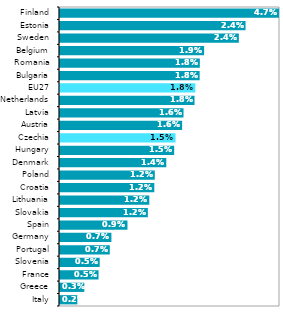
| Category | Series 0 |
|---|---|
| Italy | 0.002 |
| Greece | 0.003 |
| France | 0.005 |
| Slovenia | 0.005 |
| Portugal | 0.007 |
| Germany | 0.007 |
| Spain | 0.009 |
| Slovakia | 0.012 |
| Lithuania | 0.012 |
| Croatia | 0.012 |
| Poland | 0.012 |
| Denmark | 0.014 |
| Hungary | 0.015 |
| Czechia | 0.015 |
| Austria | 0.016 |
| Latvia | 0.016 |
| Netherlands | 0.018 |
| EU27 | 0.018 |
| Bulgaria | 0.018 |
| Romania | 0.018 |
| Belgium | 0.019 |
| Sweden | 0.024 |
| Estonia | 0.024 |
| Finland | 0.047 |